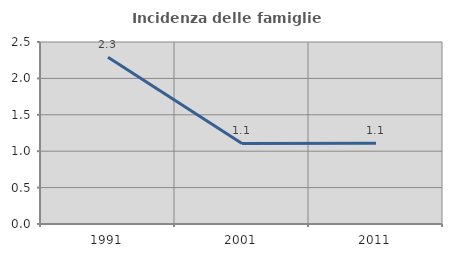
| Category | Incidenza delle famiglie numerose |
|---|---|
| 1991.0 | 2.291 |
| 2001.0 | 1.107 |
| 2011.0 | 1.109 |